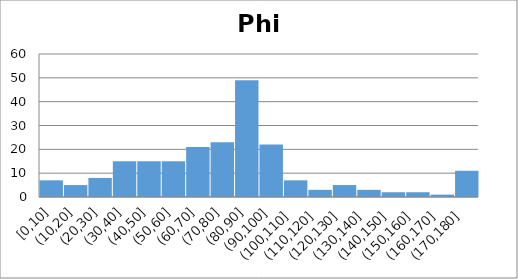
| Category | Count |
|---|---|
| 0-10 | 7 |
| 10-20 | 5 |
| 20-30 | 7 |
| 30-40 | 14 |
| 40-50 | 16 |
| 50-60 | 14 |
| 60-70 | 19 |
| 70-80 | 19 |
| 80-90 | 20 |
| 90-100 | 18 |
| 100-110 | 6 |
| 110-120 | 3 |
| 120-130 | 5 |
| 130-140 | 3 |
| 140-150 | 1 |
| 150-160 | 2 |
| 160-170 | 1 |
| 170-180 | 3 |